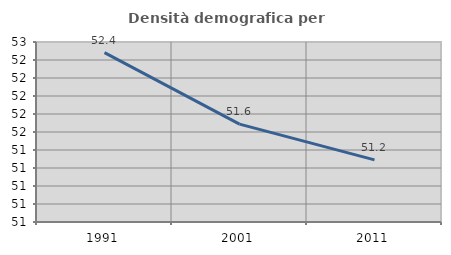
| Category | Densità demografica |
|---|---|
| 1991.0 | 52.382 |
| 2001.0 | 51.588 |
| 2011.0 | 51.19 |